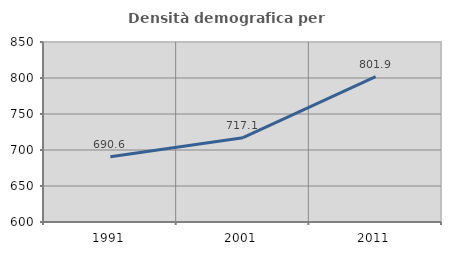
| Category | Densità demografica |
|---|---|
| 1991.0 | 690.617 |
| 2001.0 | 717.1 |
| 2011.0 | 801.924 |